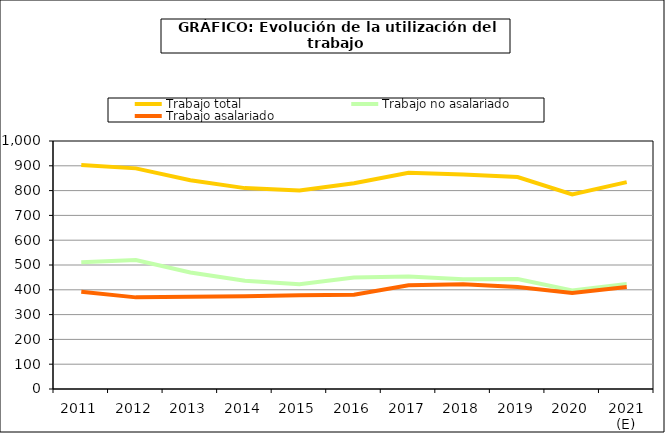
| Category | Trabajo total | Trabajo no asalariado | Trabajo asalariado |
|---|---|---|---|
| 2011 | 903.306 | 510.941 | 392.364 |
| 2012 | 889.651 | 520.158 | 369.493 |
| 2013 | 841.68 | 470.11 | 371.57 |
| 2014 | 810.011 | 436.377 | 373.634 |
| 2015 | 800.53 | 422.745 | 377.785 |
| 2016 | 829.51 | 449.21 | 380.3 |
| 2017 | 871.969 | 453.769 | 418.2 |
| 2018 | 865.29 | 443.02 | 422.27 |
| 2019 | 854.699 | 443.207 | 411.493 |
| 2020 | 784.559 | 397.366 | 387.193 |
| 2021 (E) | 834.334 | 422.972 | 411.362 |